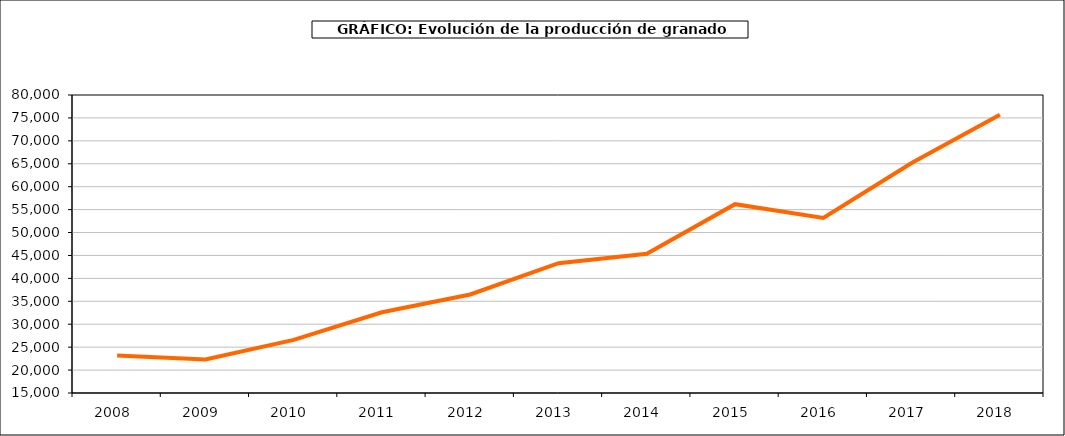
| Category | producción granado |
|---|---|
| 2008.0 | 23169 |
| 2009.0 | 22311 |
| 2010.0 | 26582 |
| 2011.0 | 32606 |
| 2012.0 | 36495 |
| 2013.0 | 43324 |
| 2014.0 | 45382 |
| 2015.0 | 56185 |
| 2016.0 | 53187 |
| 2017.0 | 65165 |
| 2018.0 | 75673 |